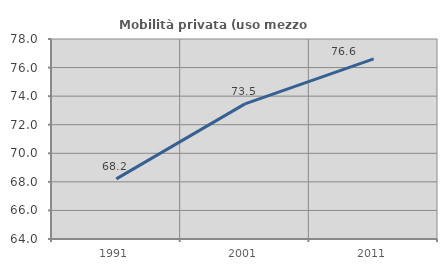
| Category | Mobilità privata (uso mezzo privato) |
|---|---|
| 1991.0 | 68.206 |
| 2001.0 | 73.457 |
| 2011.0 | 76.606 |